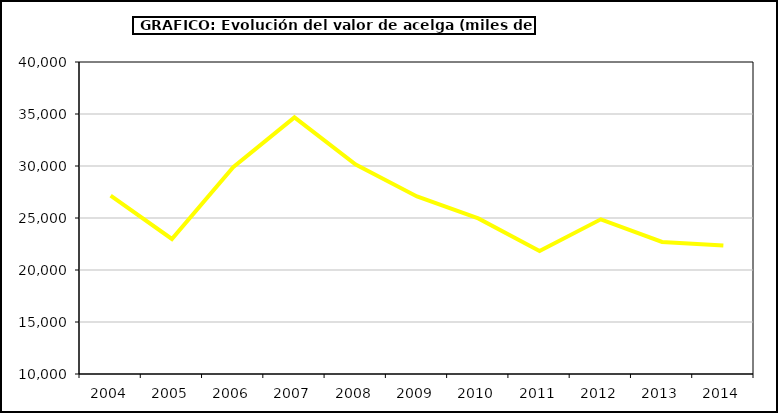
| Category | Valor |
|---|---|
| 2004.0 | 27144.607 |
| 2005.0 | 22980.023 |
| 2006.0 | 29895.222 |
| 2007.0 | 34674.708 |
| 2008.0 | 30140.616 |
| 2009.0 | 27076.764 |
| 2010.0 | 24959.936 |
| 2011.0 | 21822.946 |
| 2012.0 | 24870.933 |
| 2013.0 | 22693.234 |
| 2014.0 | 22344.648 |